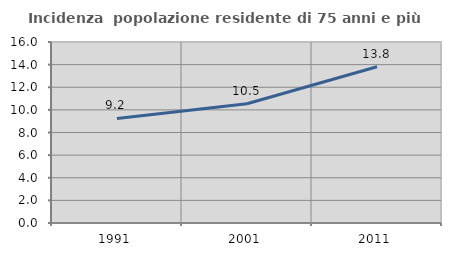
| Category | Incidenza  popolazione residente di 75 anni e più |
|---|---|
| 1991.0 | 9.242 |
| 2001.0 | 10.536 |
| 2011.0 | 13.807 |